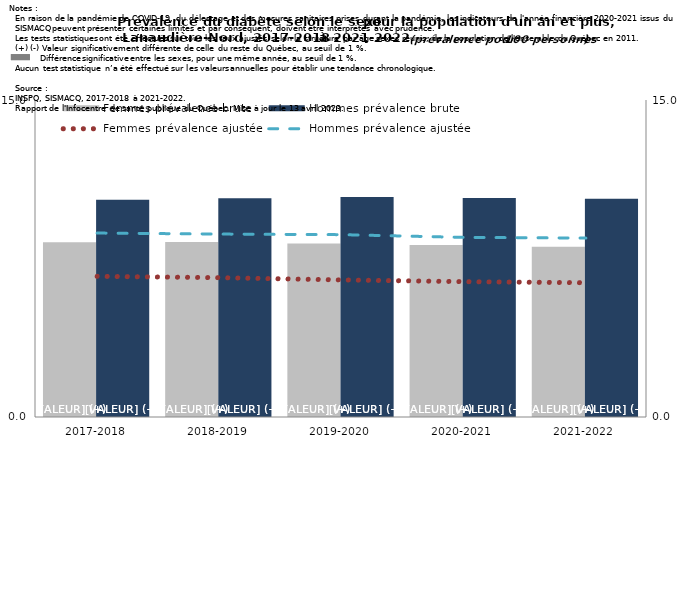
| Category | Femmes prévalence brute | Hommes prévalence brute |
|---|---|---|
| 2017-2018 | 8.272 | 10.274 |
| 2018-2019 | 8.283 | 10.352 |
| 2019-2020 | 8.215 | 10.408 |
| 2020-2021 | 8.141 | 10.361 |
| 2021-2022 | 8.059 | 10.329 |